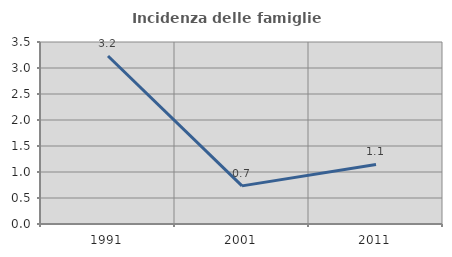
| Category | Incidenza delle famiglie numerose |
|---|---|
| 1991.0 | 3.231 |
| 2001.0 | 0.733 |
| 2011.0 | 1.146 |